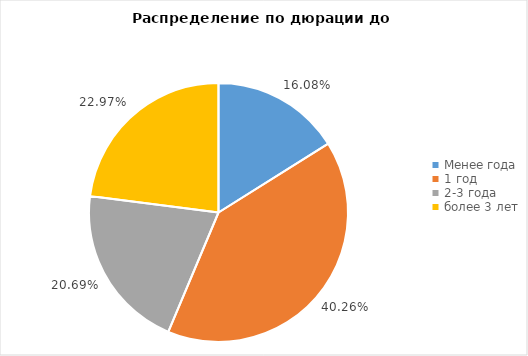
| Category | Доля |
|---|---|
| 0 | 0.148 |
| 1 | 0.515 |
| 2 | 0.292 |
| 3 | 0.045 |